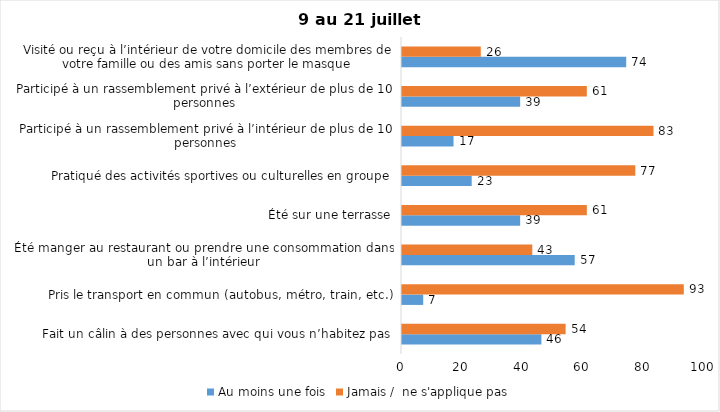
| Category | Au moins une fois | Jamais /  ne s'applique pas |
|---|---|---|
| Fait un câlin à des personnes avec qui vous n’habitez pas | 46 | 54 |
| Pris le transport en commun (autobus, métro, train, etc.) | 7 | 93 |
| Été manger au restaurant ou prendre une consommation dans un bar à l’intérieur | 57 | 43 |
| Été sur une terrasse | 39 | 61 |
| Pratiqué des activités sportives ou culturelles en groupe | 23 | 77 |
| Participé à un rassemblement privé à l’intérieur de plus de 10 personnes | 17 | 83 |
| Participé à un rassemblement privé à l’extérieur de plus de 10 personnes | 39 | 61 |
| Visité ou reçu à l’intérieur de votre domicile des membres de votre famille ou des amis sans porter le masque | 74 | 26 |